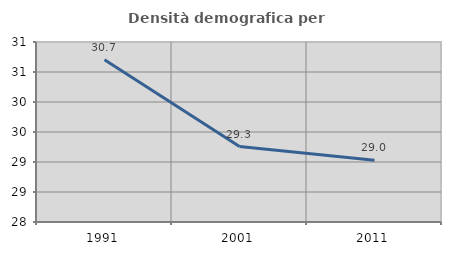
| Category | Densità demografica |
|---|---|
| 1991.0 | 30.704 |
| 2001.0 | 29.256 |
| 2011.0 | 29.028 |